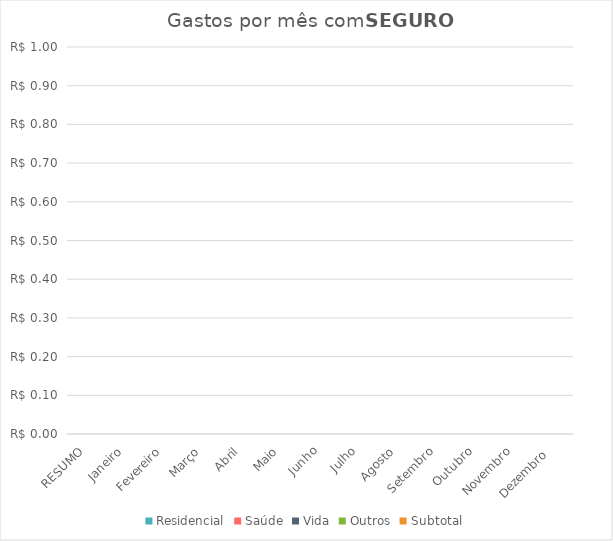
| Category | Residencial | Saúde | Vida | Outros | Subtotal |
|---|---|---|---|---|---|
| RESUMO | 0 | 0 | 0 | 0 | 0 |
| Janeiro | 0 | 0 | 0 | 0 | 0 |
| Fevereiro | 0 | 0 | 0 | 0 | 0 |
| Março | 0 | 0 | 0 | 0 | 0 |
| Abril | 0 | 0 | 0 | 0 | 0 |
| Maio | 0 | 0 | 0 | 0 | 0 |
| Junho | 0 | 0 | 0 | 0 | 0 |
| Julho | 0 | 0 | 0 | 0 | 0 |
| Agosto | 0 | 0 | 0 | 0 | 0 |
| Setembro | 0 | 0 | 0 | 0 | 0 |
| Outubro | 0 | 0 | 0 | 0 | 0 |
| Novembro | 0 | 0 | 0 | 0 | 0 |
| Dezembro  | 0 | 0 | 0 | 0 | 0 |